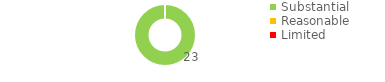
| Category | Series 0 |
|---|---|
| Substantial | 23 |
| Reasonable | 0 |
| Limited | 0 |